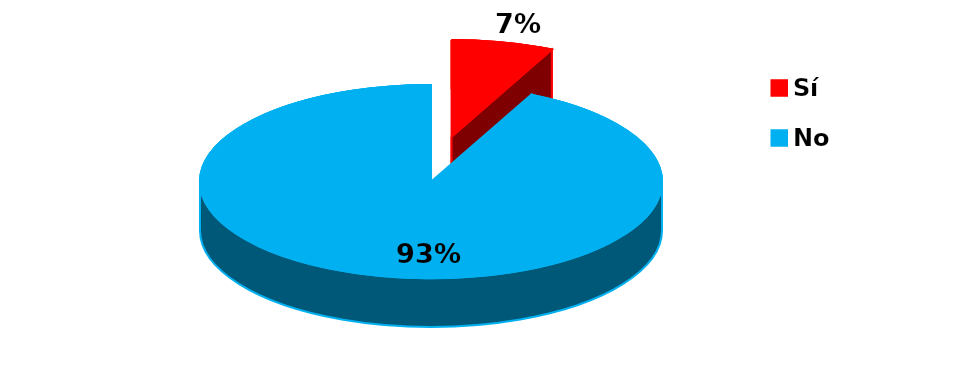
| Category | Series 0 |
|---|---|
| 0 | 2 |
| 1 | 26 |